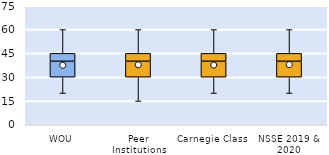
| Category | 25th | 50th | 75th |
|---|---|---|---|
| WOU | 30 | 10 | 5 |
| Peer Institutions | 30 | 10 | 5 |
| Carnegie Class | 30 | 10 | 5 |
| NSSE 2019 & 2020 | 30 | 10 | 5 |